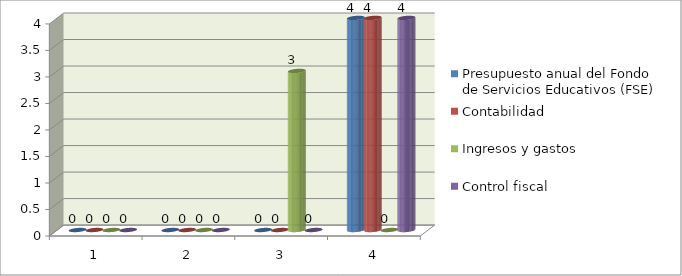
| Category | Presupuesto anual del Fondo
de Servicios Educativos (FSE) | Contabilidad | Ingresos y gastos | Control fiscal |
|---|---|---|---|---|
| 0 | 0 | 0 | 0 | 0 |
| 1 | 0 | 0 | 0 | 0 |
| 2 | 0 | 0 | 3 | 0 |
| 3 | 4 | 4 | 0 | 4 |